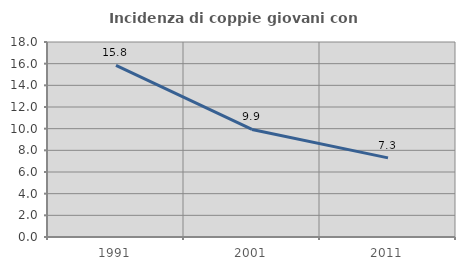
| Category | Incidenza di coppie giovani con figli |
|---|---|
| 1991.0 | 15.845 |
| 2001.0 | 9.93 |
| 2011.0 | 7.307 |